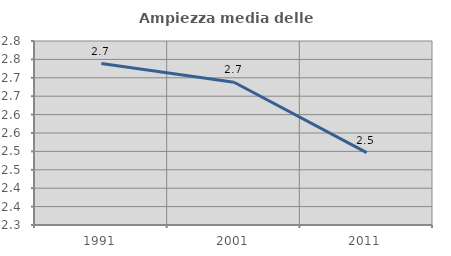
| Category | Ampiezza media delle famiglie |
|---|---|
| 1991.0 | 2.739 |
| 2001.0 | 2.688 |
| 2011.0 | 2.496 |